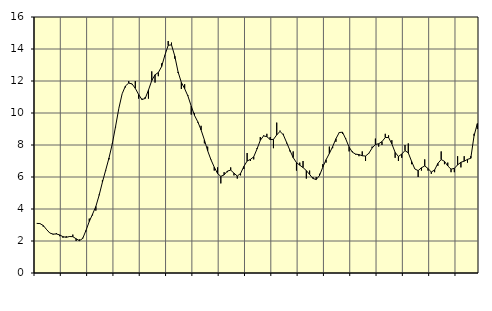
| Category | Piggar | Series 1 |
|---|---|---|
| nan | 3.1 | 3.1 |
| 87.0 | 3.1 | 3.09 |
| 87.0 | 2.9 | 2.97 |
| 87.0 | 2.7 | 2.72 |
| nan | 2.5 | 2.5 |
| 88.0 | 2.4 | 2.43 |
| 88.0 | 2.5 | 2.44 |
| 88.0 | 2.3 | 2.38 |
| nan | 2.2 | 2.27 |
| 89.0 | 2.3 | 2.23 |
| 89.0 | 2.3 | 2.28 |
| 89.0 | 2.4 | 2.27 |
| nan | 2 | 2.14 |
| 90.0 | 2.1 | 2.02 |
| 90.0 | 2.2 | 2.16 |
| 90.0 | 2.6 | 2.66 |
| nan | 3.4 | 3.22 |
| 91.0 | 3.6 | 3.68 |
| 91.0 | 3.9 | 4.16 |
| 91.0 | 4.9 | 4.86 |
| nan | 5.8 | 5.68 |
| 92.0 | 6.4 | 6.43 |
| 92.0 | 7.1 | 7.19 |
| 92.0 | 8.1 | 8.07 |
| nan | 9.1 | 9.16 |
| 93.0 | 10.3 | 10.3 |
| 93.0 | 11.2 | 11.2 |
| 93.0 | 11.6 | 11.69 |
| nan | 12 | 11.87 |
| 94.0 | 11.8 | 11.82 |
| 94.0 | 12 | 11.54 |
| 94.0 | 10.9 | 11.16 |
| nan | 10.9 | 10.84 |
| 95.0 | 11 | 10.91 |
| 95.0 | 10.9 | 11.43 |
| 95.0 | 12.6 | 12.03 |
| nan | 11.9 | 12.39 |
| 96.0 | 12.3 | 12.53 |
| 96.0 | 13.1 | 12.9 |
| 96.0 | 13.6 | 13.62 |
| nan | 14.5 | 14.23 |
| 97.0 | 14.4 | 14.26 |
| 97.0 | 13.4 | 13.56 |
| 97.0 | 12.5 | 12.57 |
| nan | 11.5 | 11.91 |
| 98.0 | 11.8 | 11.52 |
| 98.0 | 11.1 | 11.06 |
| 98.0 | 9.9 | 10.43 |
| nan | 10 | 9.85 |
| 99.0 | 9.4 | 9.45 |
| 99.0 | 9.2 | 8.94 |
| 99.0 | 8.1 | 8.32 |
| nan | 7.9 | 7.64 |
| 0.0 | 7.1 | 7.08 |
| 0.0 | 6.4 | 6.62 |
| 0.0 | 6.6 | 6.22 |
| nan | 5.6 | 6.04 |
| 1.0 | 6.3 | 6.13 |
| 1.0 | 6.3 | 6.37 |
| 1.0 | 6.6 | 6.43 |
| nan | 6.1 | 6.24 |
| 2.0 | 5.9 | 6.06 |
| 2.0 | 6.1 | 6.22 |
| 2.0 | 6.5 | 6.66 |
| nan | 7.5 | 7 |
| 3.0 | 7 | 7.1 |
| 3.0 | 7.1 | 7.26 |
| 3.0 | 7.8 | 7.75 |
| nan | 8.5 | 8.29 |
| 4.0 | 8.6 | 8.57 |
| 4.0 | 8.7 | 8.52 |
| 4.0 | 8.5 | 8.34 |
| nan | 7.8 | 8.35 |
| 5.0 | 9.4 | 8.63 |
| 5.0 | 8.9 | 8.85 |
| 5.0 | 8.7 | 8.64 |
| nan | 8.1 | 8.16 |
| 6.0 | 7.6 | 7.67 |
| 6.0 | 7.6 | 7.21 |
| 6.0 | 6.4 | 6.9 |
| nan | 6.9 | 6.74 |
| 7.0 | 7 | 6.59 |
| 7.0 | 5.9 | 6.4 |
| 7.0 | 6.4 | 6.16 |
| nan | 6 | 5.91 |
| 8.0 | 6 | 5.84 |
| 8.0 | 6.2 | 6.09 |
| 8.0 | 6.8 | 6.61 |
| nan | 6.9 | 7.08 |
| 9.0 | 7.9 | 7.47 |
| 9.0 | 7.8 | 7.9 |
| 9.0 | 8.2 | 8.39 |
| nan | 8.8 | 8.78 |
| 10.0 | 8.7 | 8.8 |
| 10.0 | 8.4 | 8.37 |
| 10.0 | 7.6 | 7.87 |
| nan | 7.6 | 7.55 |
| 11.0 | 7.4 | 7.43 |
| 11.0 | 7.3 | 7.4 |
| 11.0 | 7.6 | 7.33 |
| nan | 7 | 7.31 |
| 12.0 | 7.5 | 7.48 |
| 12.0 | 7.9 | 7.81 |
| 12.0 | 8.4 | 8.03 |
| nan | 7.9 | 8.08 |
| 13.0 | 8 | 8.21 |
| 13.0 | 8.7 | 8.47 |
| 13.0 | 8.6 | 8.47 |
| nan | 8.3 | 8.07 |
| 14.0 | 7.2 | 7.54 |
| 14.0 | 7 | 7.28 |
| 14.0 | 7.2 | 7.43 |
| nan | 8 | 7.65 |
| 15.0 | 8.1 | 7.51 |
| 15.0 | 6.8 | 6.98 |
| 15.0 | 6.5 | 6.5 |
| nan | 6 | 6.4 |
| 16.0 | 6.4 | 6.58 |
| 16.0 | 7.1 | 6.69 |
| 16.0 | 6.4 | 6.53 |
| nan | 6.2 | 6.31 |
| 17.0 | 6.3 | 6.44 |
| 17.0 | 6.7 | 6.85 |
| 17.0 | 7.6 | 7.09 |
| nan | 6.8 | 6.98 |
| 18.0 | 6.9 | 6.69 |
| 18.0 | 6.3 | 6.49 |
| 18.0 | 6.3 | 6.54 |
| nan | 7.3 | 6.76 |
| 19.0 | 6.6 | 6.92 |
| 19.0 | 7.3 | 6.99 |
| 19.0 | 6.9 | 7.1 |
| nan | 7.3 | 7.17 |
| 20.0 | 8.7 | 8.58 |
| 20.0 | 9 | 9.34 |